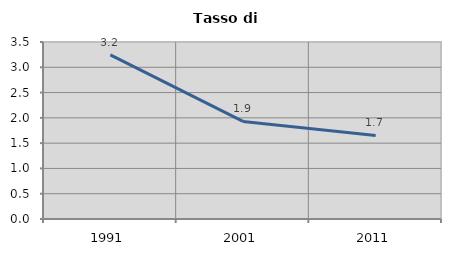
| Category | Tasso di disoccupazione   |
|---|---|
| 1991.0 | 3.246 |
| 2001.0 | 1.929 |
| 2011.0 | 1.652 |